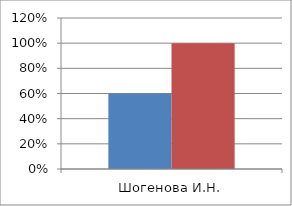
| Category | Series 0 | 2 |
|---|---|---|
| Шогенова И.Н. | 0.6 | 1 |